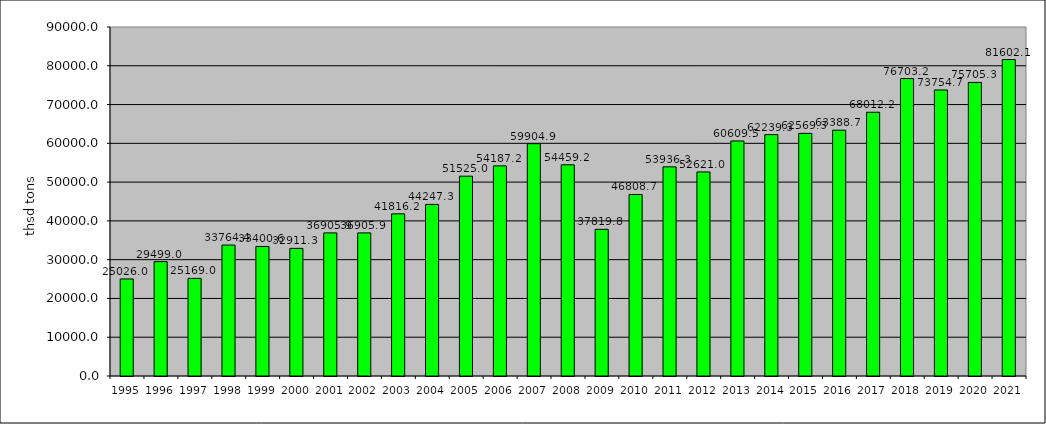
| Category | freigt transported (thou tons) |
|---|---|
| 1995.0 | 25026 |
| 1996.0 | 29499 |
| 1997.0 | 25169 |
| 1998.0 | 33764.4 |
| 1999.0 | 33400.6 |
| 2000.0 | 32911.3 |
| 2001.0 | 36905.9 |
| 2002.0 | 36905.9 |
| 2003.0 | 41816.2 |
| 2004.0 | 44247.3 |
| 2005.0 | 51525 |
| 2006.0 | 54187.2 |
| 2007.0 | 59904.9 |
| 2008.0 | 54459.2 |
| 2009.0 | 37819.8 |
| 2010.0 | 46808.7 |
| 2011.0 | 53936.3 |
| 2012.0 | 52621 |
| 2013.0 | 60609.5 |
| 2014.0 | 62239.3 |
| 2015.0 | 62569.3 |
| 2016.0 | 63388.7 |
| 2017.0 | 68012.2 |
| 2018.0 | 76703.2 |
| 2019.0 | 73754.7 |
| 2020.0 | 75705.3 |
| 2021.0 | 81602.1 |